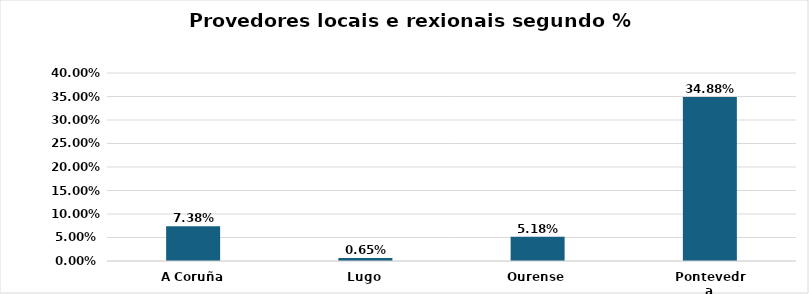
| Category | % facturado sobre TOTAL |
|---|---|
| A Coruña | 0.074 |
| Lugo | 0.007 |
| Ourense | 0.052 |
| Pontevedra | 0.349 |